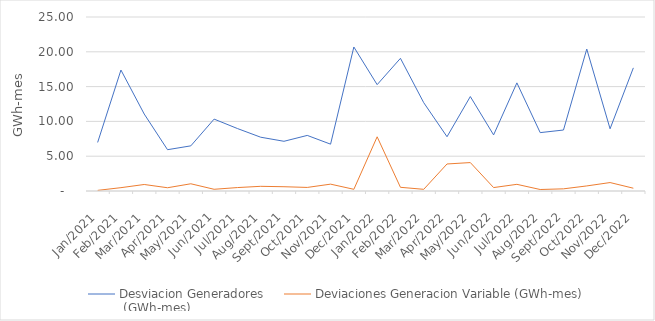
| Category |  Desviacion Generadores
 (GWh-mes)  |  Deviaciones Generacion Variable (GWh-mes)  |
|---|---|---|
| 2021-01-01 | 6.976 | 0.092 |
| 2021-02-01 | 17.379 | 0.478 |
| 2021-03-01 | 11.058 | 0.936 |
| 2021-04-01 | 5.935 | 0.469 |
| 2021-05-01 | 6.488 | 1.037 |
| 2021-06-01 | 10.33 | 0.245 |
| 2021-07-01 | 8.976 | 0.493 |
| 2021-08-01 | 7.729 | 0.673 |
| 2021-09-01 | 7.142 | 0.615 |
| 2021-10-01 | 7.987 | 0.513 |
| 2021-11-01 | 6.728 | 0.985 |
| 2021-12-01 | 20.69 | 0.244 |
| 2022-01-01 | 15.28 | 7.786 |
| 2022-02-01 | 19.063 | 0.531 |
| 2022-03-01 | 12.69 | 0.242 |
| 2022-04-01 | 7.798 | 3.882 |
| 2022-05-01 | 13.571 | 4.086 |
| 2022-06-01 | 8.058 | 0.493 |
| 2022-07-01 | 15.534 | 0.958 |
| 2022-08-01 | 8.388 | 0.213 |
| 2022-09-01 | 8.76 | 0.31 |
| 2022-10-01 | 20.391 | 0.729 |
| 2022-11-01 | 8.939 | 1.213 |
| 2022-12-01 | 17.689 | 0.401 |